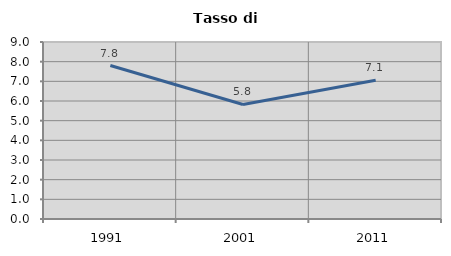
| Category | Tasso di disoccupazione   |
|---|---|
| 1991.0 | 7.803 |
| 2001.0 | 5.823 |
| 2011.0 | 7.053 |